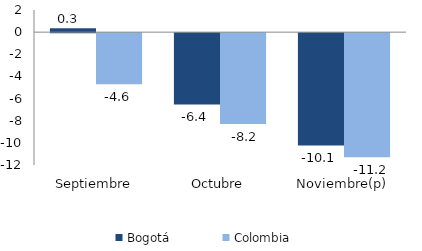
| Category | Bogotá | Colombia |
|---|---|---|
| Septiembre | 0.35 | -4.616 |
| Octubre | -6.434 | -8.204 |
| Noviembre(p) | -10.141 | -11.203 |